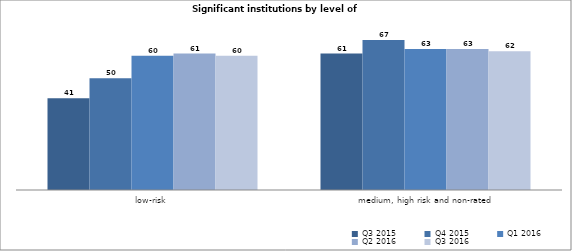
| Category | Q3 2015 | Q4 2015 | Q1 2016 | Q2 2016 | Q3 2016 |
|---|---|---|---|---|---|
| low-risk | 41 | 50 | 60 | 61 | 60 |
| medium, high risk and non-rated | 61 | 67 | 63 | 63 | 62 |